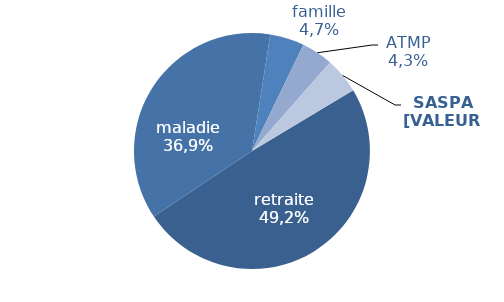
| Category | Series 0 |
|---|---|
| ü retraite | 0.492 |
| ü maladie-maternité-invalidité-décès | 0.369 |
| ü famille | 0.047 |
| ü accident du travail et maladie professionnelle | 0.043 |
| ü SASPA | 0.049 |